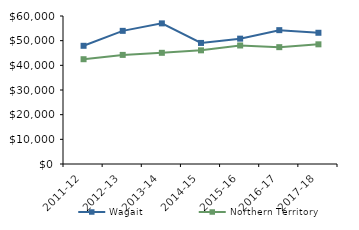
| Category | Wagait | Northern Territory |
|---|---|---|
| 2011-12 | 47918.02 | 42481 |
| 2012-13 | 53978.87 | 44232.02 |
| 2013-14 | 57005.42 | 45075.51 |
| 2014-15 | 49077 | 46083.65 |
| 2015-16 | 50818 | 48046.27 |
| 2016-17 | 54263.33 | 47367.05 |
| 2017-18 | 53200.9 | 48519 |